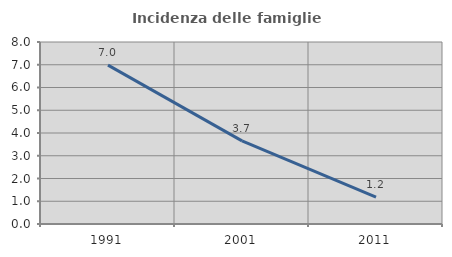
| Category | Incidenza delle famiglie numerose |
|---|---|
| 1991.0 | 6.985 |
| 2001.0 | 3.654 |
| 2011.0 | 1.176 |